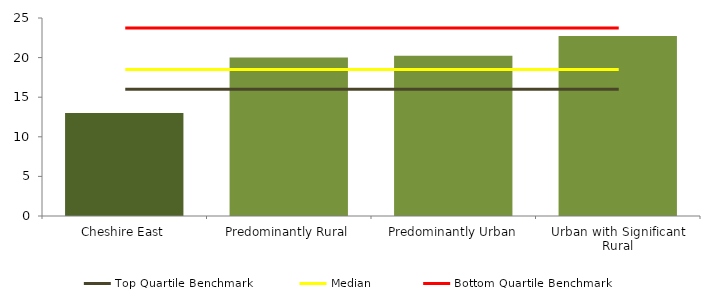
| Category | Series 0 |
|---|---|
| Cheshire East | 13 |
| Predominantly Rural | 20 |
| Predominantly Urban | 20.222 |
| Urban with Significant Rural | 22.727 |